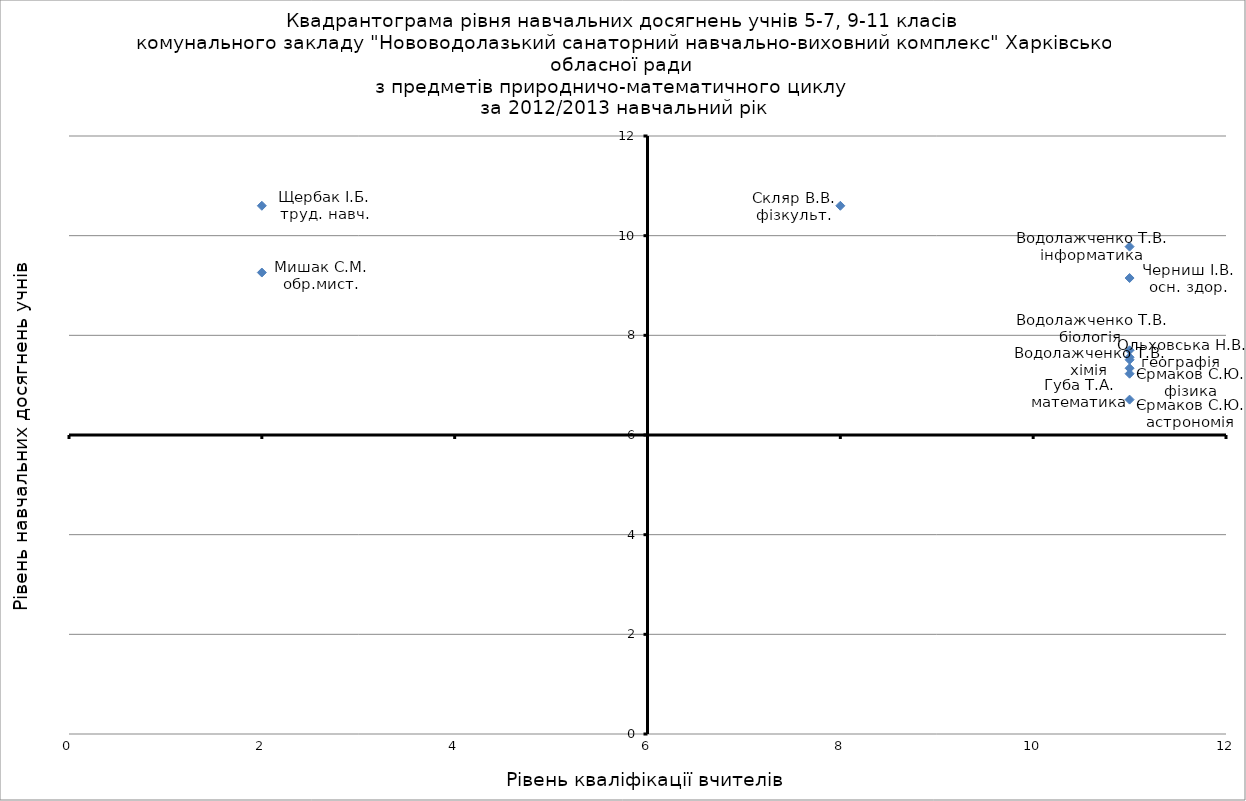
| Category | Series 0 |
|---|---|
| 11.0 | 7.34 |
| 11.0 | 7.23 |
| 11.0 | 7.56 |
| 11.0 | 7.51 |
| 11.0 | 9.15 |
| 8.0 | 10.6 |
| 2.0 | 10.6 |
| 2.0 | 9.26 |
| 11.0 | 7.7 |
| 11.0 | 9.78 |
| 11.0 | 6.71 |